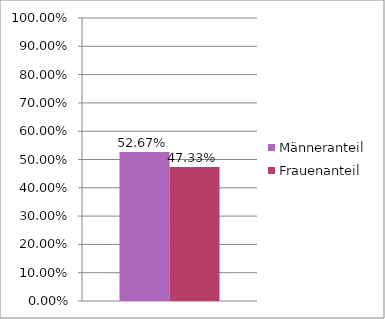
| Category | Männeranteil | Frauenanteil |
|---|---|---|
| 0 | 0.527 | 0.473 |